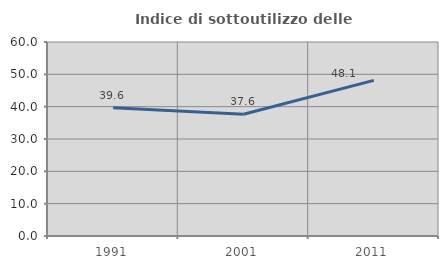
| Category | Indice di sottoutilizzo delle abitazioni  |
|---|---|
| 1991.0 | 39.637 |
| 2001.0 | 37.634 |
| 2011.0 | 48.138 |